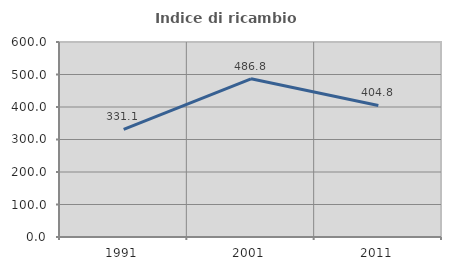
| Category | Indice di ricambio occupazionale  |
|---|---|
| 1991.0 | 331.068 |
| 2001.0 | 486.813 |
| 2011.0 | 404.808 |